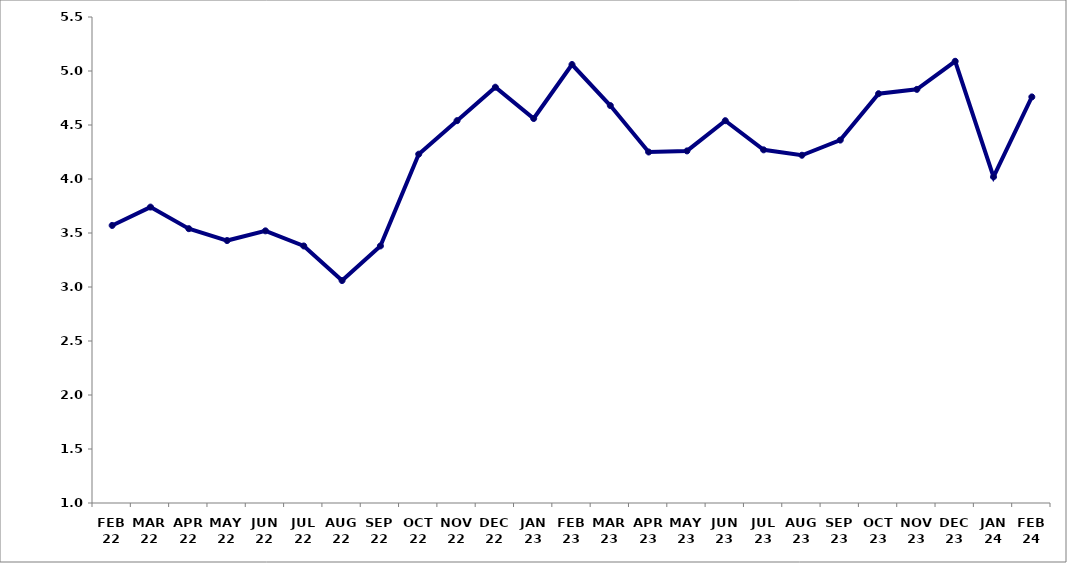
| Category | Series 0 |
|---|---|
| FEB 22 | 3.57 |
| MAR 22 | 3.74 |
| APR 22 | 3.54 |
| MAY 22 | 3.43 |
| JUN 22 | 3.52 |
| JUL 22 | 3.38 |
| AUG 22 | 3.06 |
| SEP 22 | 3.38 |
| OCT 22 | 4.23 |
| NOV 22 | 4.54 |
| DEC 22 | 4.85 |
| JAN 23 | 4.56 |
| FEB 23 | 5.06 |
| MAR 23 | 4.68 |
| APR 23 | 4.25 |
| MAY 23 | 4.26 |
| JUN 23 | 4.54 |
| JUL 23 | 4.27 |
| AUG 23 | 4.22 |
| SEP 23 | 4.36 |
| OCT 23 | 4.79 |
| NOV 23 | 4.83 |
| DEC 23 | 5.09 |
| JAN 24 | 4.02 |
| FEB 24 | 4.76 |